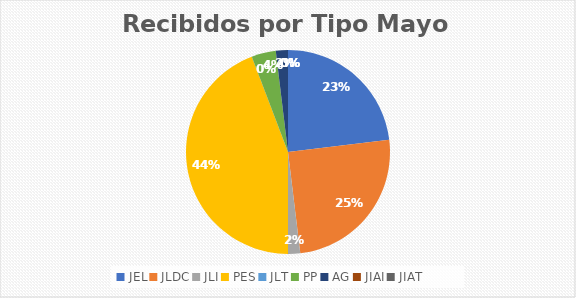
| Category | Series 0 |
|---|---|
| JEL | 12 |
| JLDC | 13 |
| JLI | 1 |
| PES | 23 |
| JLT | 0 |
| PP | 2 |
| AG | 1 |
| JIAI | 0 |
| JIAT | 0 |